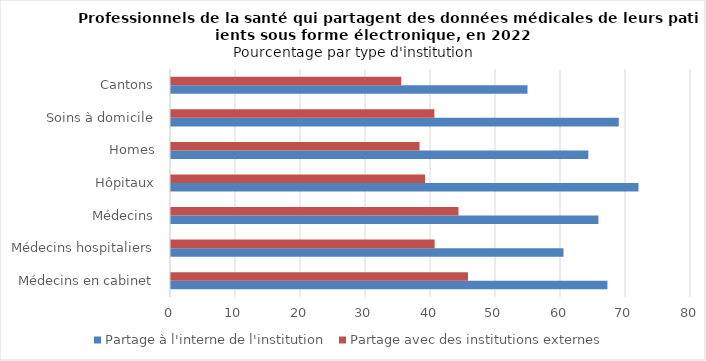
| Category | Partage à l'interne de l'institution | Partage avec des institutions externes |
|---|---|---|
| Médecins en cabinet | 67.14 | 45.69 |
| Médecins hospitaliers | 60.38 | 40.56 |
| Médecins | 65.76 | 44.23 |
| Hôpitaux | 71.92 | 39.09 |
| Homes | 64.2 | 38.23 |
| Soins à domicile | 68.89 | 40.52 |
| Cantons | 54.85 | 35.42 |